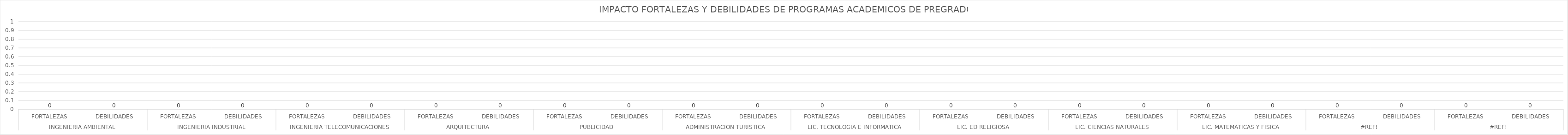
| Category | Series 0 |
|---|---|
| 0 | 0 |
| 1 | 0 |
| 2 | 0 |
| 3 | 0 |
| 4 | 0 |
| 5 | 0 |
| 6 | 0 |
| 7 | 0 |
| 8 | 0 |
| 9 | 0 |
| 10 | 0 |
| 11 | 0 |
| 12 | 0 |
| 13 | 0 |
| 14 | 0 |
| 15 | 0 |
| 16 | 0 |
| 17 | 0 |
| 18 | 0 |
| 19 | 0 |
| 20 | 0 |
| 21 | 0 |
| 22 | 0 |
| 23 | 0 |